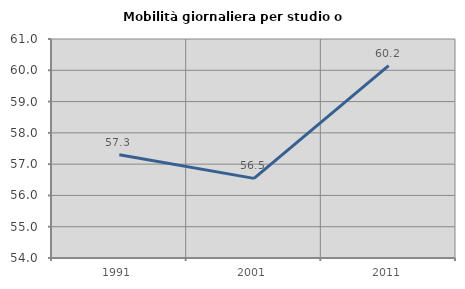
| Category | Mobilità giornaliera per studio o lavoro |
|---|---|
| 1991.0 | 57.3 |
| 2001.0 | 56.545 |
| 2011.0 | 60.15 |